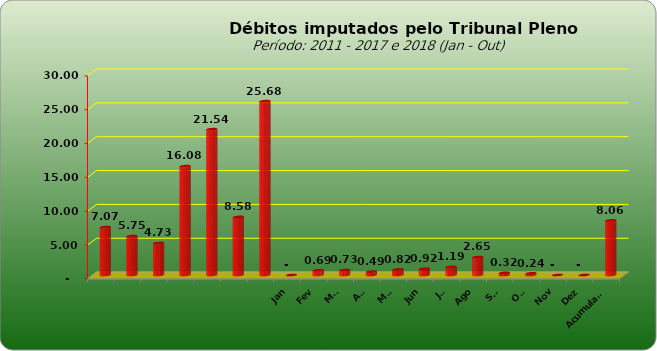
| Category |  7.073.154,74  |
|---|---|
|  | 7073154.74 |
|  | 5749129.25 |
|  | 4727033.51 |
|  | 16081820.48 |
|  | 21535723.6 |
|  | 8578266.09 |
|  | 25676499.17 |
| Jan | 0 |
| Fev | 689867.86 |
| Mar | 729624.1 |
| Abr | 491509.68 |
| Mai | 824303.32 |
| Jun | 924019.84 |
| Jul | 1188655.7 |
| Ago | 2651249.45 |
| Set | 319560.5 |
| Out | 243398.37 |
| Nov | 0 |
| Dez | 0 |
| Acumulado | 8059556.37 |